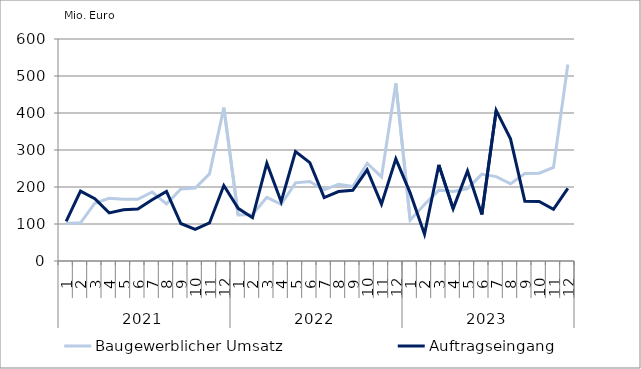
| Category | Baugewerblicher Umsatz | Auftragseingang |
|---|---|---|
| 0 | 101295.895 | 106850.127 |
| 1 | 103236.543 | 188883.434 |
| 2 | 156172.725 | 168204.42 |
| 3 | 169257.088 | 130052.073 |
| 4 | 166897.821 | 138492.214 |
| 5 | 166720.216 | 140262.426 |
| 6 | 186515.191 | 165331.191 |
| 7 | 154188.941 | 188169.655 |
| 8 | 194464.12 | 101359.538 |
| 9 | 197281.201 | 85626.862 |
| 10 | 235325.083 | 102880.924 |
| 11 | 414469.471 | 203900.676 |
| 12 | 124217.549 | 142351.759 |
| 13 | 125619.696 | 117194.423 |
| 14 | 171896.664 | 264509.013 |
| 15 | 153384.654 | 160146.519 |
| 16 | 211335.38 | 295997.826 |
| 17 | 214914.164 | 265813.917 |
| 18 | 192047.613 | 171529.517 |
| 19 | 207577.681 | 187809.656 |
| 20 | 201109.781 | 190941.096 |
| 21 | 264135.048 | 246250.021 |
| 22 | 227299.047 | 153783.993 |
| 23 | 480026.589 | 276019.328 |
| 24 | 110408.991 | 184068.731 |
| 25 | 152702.87 | 72330.186 |
| 26 | 191677.032 | 259741.102 |
| 27 | 187876.702 | 141464.389 |
| 28 | 195815.34 | 243069.898 |
| 29 | 234759.067 | 125882.939 |
| 30 | 228043.08 | 406932.293 |
| 31 | 208510.786 | 330128.024 |
| 32 | 236511.503 | 161760.047 |
| 33 | 237275.194 | 161029.305 |
| 34 | 252921.567 | 139832.011 |
| 35 | 530955.69 | 196157.417 |